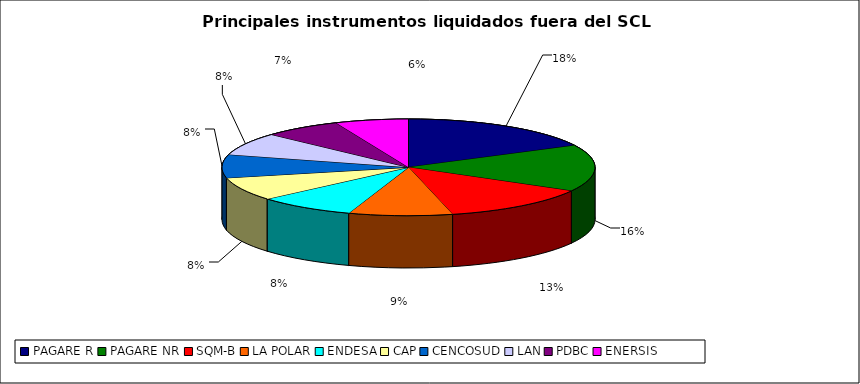
| Category | Series 0 |
|---|---|
| PAGARE R | 1520 |
| PAGARE NR | 1354 |
| SQM-B | 1137 |
| LA POLAR | 780 |
| ENDESA | 736 |
| CAP | 681 |
| CENCOSUD | 675 |
| LAN | 658 |
| PDBC | 588 |
| ENERSIS | 552 |